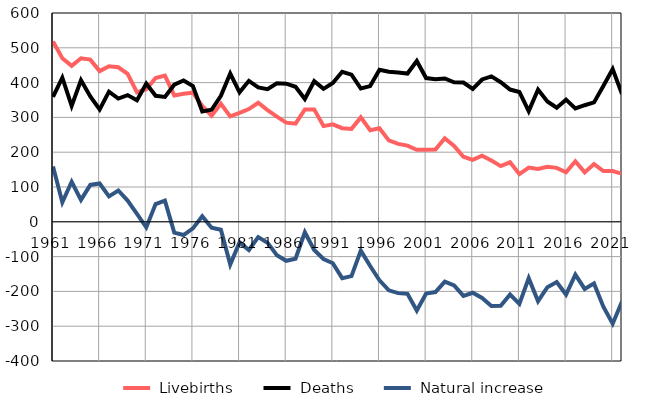
| Category |  Livebirths |  Deaths |  Natural increase |
|---|---|---|---|
| 1961.0 | 518 | 359 | 159 |
| 1962.0 | 470 | 414 | 56 |
| 1963.0 | 448 | 333 | 115 |
| 1964.0 | 470 | 407 | 63 |
| 1965.0 | 466 | 360 | 106 |
| 1966.0 | 433 | 323 | 110 |
| 1967.0 | 447 | 374 | 73 |
| 1968.0 | 444 | 354 | 90 |
| 1969.0 | 425 | 364 | 61 |
| 1970.0 | 372 | 349 | 23 |
| 1971.0 | 381 | 397 | -16 |
| 1972.0 | 413 | 362 | 51 |
| 1973.0 | 420 | 359 | 61 |
| 1974.0 | 363 | 394 | -31 |
| 1975.0 | 368 | 406 | -38 |
| 1976.0 | 371 | 390 | -19 |
| 1977.0 | 333 | 317 | 16 |
| 1978.0 | 305 | 322 | -17 |
| 1979.0 | 339 | 362 | -23 |
| 1980.0 | 303 | 426 | -123 |
| 1981.0 | 313 | 372 | -59 |
| 1982.0 | 324 | 405 | -81 |
| 1983.0 | 342 | 386 | -44 |
| 1984.0 | 321 | 381 | -60 |
| 1985.0 | 302 | 398 | -96 |
| 1986.0 | 285 | 397 | -112 |
| 1987.0 | 282 | 388 | -106 |
| 1988.0 | 323 | 353 | -30 |
| 1989.0 | 323 | 404 | -81 |
| 1990.0 | 275 | 382 | -107 |
| 1991.0 | 280 | 399 | -119 |
| 1992.0 | 269 | 431 | -162 |
| 1993.0 | 267 | 423 | -156 |
| 1994.0 | 300 | 383 | -83 |
| 1995.0 | 263 | 390 | -127 |
| 1996.0 | 269 | 437 | -168 |
| 1997.0 | 234 | 431 | -197 |
| 1998.0 | 224 | 429 | -205 |
| 1999.0 | 219 | 426 | -207 |
| 2000.0 | 207 | 462 | -255 |
| 2001.0 | 207 | 413 | -206 |
| 2002.0 | 208 | 410 | -202 |
| 2003.0 | 240 | 412 | -172 |
| 2004.0 | 218 | 401 | -183 |
| 2005.0 | 187 | 400 | -213 |
| 2006.0 | 178 | 382 | -204 |
| 2007.0 | 190 | 409 | -219 |
| 2008.0 | 176 | 418 | -242 |
| 2009.0 | 160 | 401 | -241 |
| 2010.0 | 171 | 380 | -209 |
| 2011.0 | 137 | 373 | -236 |
| 2012.0 | 156 | 318 | -162 |
| 2013.0 | 152 | 380 | -228 |
| 2014.0 | 158 | 346 | -188 |
| 2015.0 | 155 | 328 | -173 |
| 2016.0 | 142 | 351 | -209 |
| 2017.0 | 174 | 326 | -152 |
| 2018.0 | 142 | 335 | -193 |
| 2019.0 | 166 | 343 | -177 |
| 2020.0 | 146 | 390 | -244 |
| 2021.0 | 146 | 439 | -293 |
| 2022.0 | 138 | 367 | -229 |